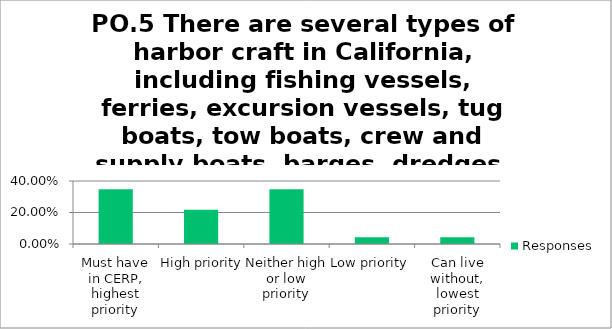
| Category | Responses |
|---|---|
| Must have in CERP, highest priority | 0.348 |
| High priority | 0.217 |
| Neither high or low priority | 0.348 |
| Low priority | 0.044 |
| Can live without, lowest priority | 0.044 |